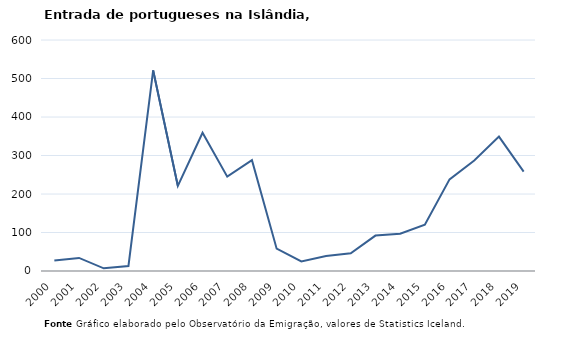
| Category | Entradas |
|---|---|
| 2000.0 | 27 |
| 2001.0 | 34 |
| 2002.0 | 7 |
| 2003.0 | 13 |
| 2004.0 | 521 |
| 2005.0 | 221 |
| 2006.0 | 359 |
| 2007.0 | 245 |
| 2008.0 | 288 |
| 2009.0 | 58 |
| 2010.0 | 25 |
| 2011.0 | 39 |
| 2012.0 | 46 |
| 2013.0 | 92 |
| 2014.0 | 97 |
| 2015.0 | 120 |
| 2016.0 | 238 |
| 2017.0 | 287 |
| 2018.0 | 349 |
| 2019.0 | 258 |